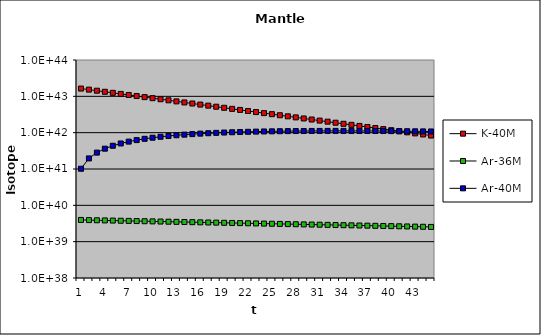
| Category | K-40M | Ar-36M | Ar-40M |
|---|---|---|---|
| 0 | 16355377500000000166264591792034870017916928 | 3959999999999999888185509891084650545152 | 101616437999999992219529131048380087140352 |
| 1 | 15285621323857499769714456157490162150932480 | 3920399999999999762366443732637740695552 | 195570285259733988867803854899541830533120 |
| 2 | 14285834689927999243086474600355194514440192 | 3881196000000000242268478043089887297536 | 282372890495550996935753293058924221562880 |
| 3 | 13351441100363800717422091741346766602108928 | 3842384039999999768364723612953610289152 | 362502055021870028277630565997872144187392 |
| 4 | 12478163392312299283537849173504377648840704 | 3803960199600000097091047672773951356928 | 436404228002267036311840148212192536166400 |
| 5 | 11662004159311399909159523766949319614136320 | 3765920597604000283503639236313733922816 | 504496558105602970165154036745571070377984 |
| 6 | 10899227453263300324581557978189183242469376 | 3728261391627960171865279078633970860032 | 567168810959426983300143591024658185453568 |
| 7 | 10186341683227699760785584884771450446151680 | 3690978777711680201424251305385732866048 | 624785161178542984297209391747422499110912 |
| 8 | 9520083632752819786831940676014491442348032 | 3654068989934560050685488459809061601280 | 677685867172501979028948660404694324084736 |
| 9 | 8897403522585360501065439441428199614971904 | 3617528300035219799675385369945069060096 | 726188836399201953597741655027025939791872 |
| 10 | 8315451050383619774806005274761012183040000 | 3581353017034869971173237960918800793600 | 770591088230282933903409815879462768607232 |
| 11 | 7771562343531179498968667653071384925437952 | 3545539486864519911419958514851791241216 | 811170121125313950164137393158499229237248 |
| 12 | 7263247765327829787584280577577109105410048 | 3510084091995869163336246898555361427456 | 848185190373751018607338122847287257333760 |
| 13 | 6788180518741030133227125480168495108849664 | 3474983251075910242006978702790264619008 | 881878502254246024783827950837008930177024 |
| 14 | 6344185995551739418583312228375152054763520 | 3440233418565149725143699966646227566592 | 912476330078301023817518031464750290829312 |
| 15 | 5929231822140689757399643326744739857825792 | 3405831084379500246798381723410487050240 | 940190057227657960041949873245431640621056 |
| 16 | 5541418556349930083095951407141666603139072 | 3371772773535709808025366951401516695552 | 965217151960649999742980648052851384254464 |
| 17 | 5178970992834749721631685627490837752446976 | 3338055045800350165156262993093088772096 | 987742078450378997739292208866322615894016 |
| 18 | 4840230037106410231888135372564147038322688 | 3304674495342349788577944066978574499840 | 1007937148225710007937440844282918606995456 |
| 19 | 4523645111069390284841298684295516224749568 | 3271627750388920276286212043528644591616 | 1025963315913250022955246444766631139737600 |
| 20 | 4227767055289680304445053585229197214744576 | 3238911472885029755794206543147557715968 | 1041970922923429983888500177744309937766400 |
| 21 | 3951241495504339783638216279782550382051328 | 3206522358156180884768731622978508292096 | 1056100392485760040411607211386661802868736 |
| 22 | 3692802643007890021216253913725624226152448 | 3174457134574619783142648781306790412288 | 1068482879215239950120697022280757426520064 |
| 23 | 3451267500536669956208967774725652426522624 | 3142712563228879787100676916541388750848 | 1079240876184199974476275578156819186450432 |
| 24 | 3225530447129070279269643976506055694745600 | 3111285437596589907241061592282863501312 | 1088488782278909984428749408306369958772736 |
| 25 | 3014558177173700213023170420825513862889472 | 3080172583220619921999380678913424359424 | 1096333432438849926737103208781927063486464 |
| 26 | 2817384970479299750026274119093171739688960 | 3049370857388409781681214928433180573696 | 1102874593206359981808103633926608088203264 |
| 27 | 2633108271715159995564175096963450095534080 | 3018877148814529866747738645765793251328 | 1108205425855710053875316614163048679079936 |
| 28 | 2460884558987090086942726334484612848287744 | 2988688377326380221991939744716252250112 | 1112412919222299960997605292830497309720576 |
| 29 | 2299925482637419908434127111763022751727616 | 2958801493553120040504850093083467972608 | 1115578294213700059273131482709506962489344 |
| 30 | 2149494256594549927780547295530304411795456 | 2929213478617589843508231872294848299008 | 1117777381855060052457860808409767158480896 |
| 31 | 2008902285753469898622213223744117011382272 | 2899921343831410112778301375197415997440 | 1119080976599740016051319708372540825010176 |
| 32 | 1877506013949200113201622340813046281142272 | 2870922130393099819766850147527342161920 | 1119555166523360014834720813029716226211840 |
| 33 | 1754703978094820136943212554039365862424576 | 2842212909089170121164437731778431549440 | 1119261641913049974387057731178346202529792 |
| 34 | 1639934054999569988254447806674740581498880 | 2813790779998280263564668266770138660864 | 1118257983665250069216101298866699074797568 |
| 35 | 1532670888264220068929930074013302565896192 | 2785652872198290074392263738718179819520 | 1116597932812830068423193610468964765270016 |
| 36 | 1432423483475519984143837105556717238747136 | 2757796343476309984400871705343829213184 | 1114331642415650025848568904752485822889984 |
| 37 | 1338732960691830034665851509123606210674688 | 2730218380041549713443280886522659733504 | 1111505912968550212278404232114078568415232 |
| 38 | 1251170453931860135273889163735394429173760 | 2702916196241130033425512211040488652800 | 1108164412404499997677289029520482986098688 |
| 39 | 1169335148051540015939883248752709626494976 | 2675887034278720093132804155387905310720 | 1104347881700989967997141610129895796506624 |
| 40 | 1092852444022930017494731478170363116912640 | 2649128163935929884998499822443954176000 | 1100094327031019939068407418835500766593024 |
| 41 | 1021372244216730073217225217403142914703360 | 2622636882296569981685605016904927281152 | 1095439199339069923252162229211281330536448 |
| 42 | 954567349839243995736012648835561356787712 | 2596410513473609897329181076688394518528 | 1090415562164499939963010876263884535103488 |
| 43 | 892131963188307995206619830953615445458944 | 2570446408338870132288341284558538276864 | 1085054248481240017087194612850228006486016 |
| 44 | 833780287872049972617717016683606806888448 | 2544741944255479937942070647645922131968 | 1079384007272149928200806566062964611219456 |